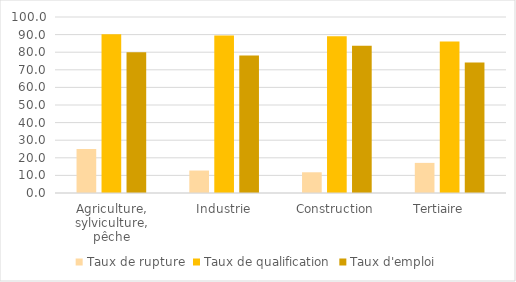
| Category | Taux de rupture | Taux de qualification | Taux d'emploi |
|---|---|---|---|
| Agriculture, sylviculture, pêche | 25.065 | 90.268 | 79.935 |
| Industrie | 12.761 | 89.458 | 78.088 |
| Construction | 11.776 | 89.065 | 83.647 |
| Tertiaire      | 17.112 | 86.119 | 74.108 |